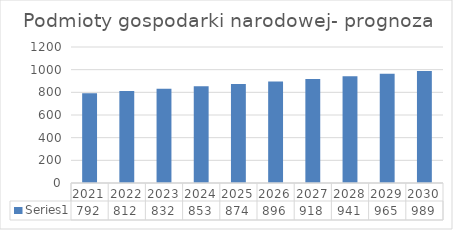
| Category | Series 0 |
|---|---|
| 2021.0 | 792 |
| 2022.0 | 811.8 |
| 2023.0 | 832.095 |
| 2024.0 | 852.897 |
| 2025.0 | 874.22 |
| 2026.0 | 896.075 |
| 2027.0 | 918.477 |
| 2028.0 | 941.439 |
| 2029.0 | 964.975 |
| 2030.0 | 989.099 |